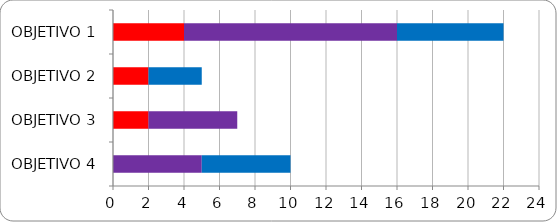
| Category | Series 0 | Series 1 | Series 2 |
|---|---|---|---|
| OBJETIVO 1 | 4 | 12 | 6 |
| OBJETIVO 2 | 2 | 0 | 3 |
| OBJETIVO 3 | 2 | 5 | 0 |
| OBJETIVO 4 | 0 | 5 | 5 |